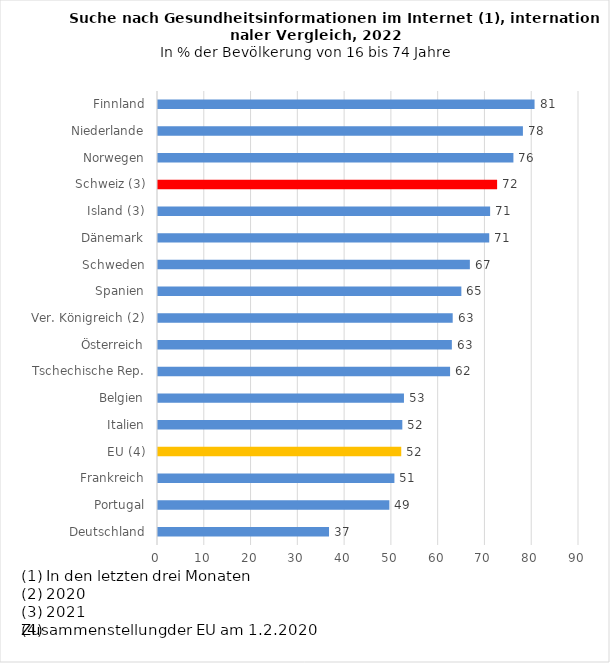
| Category | Series 0 |
|---|---|
| Deutschland | 36.56 |
| Portugal | 49.46 |
| Frankreich | 50.54 |
| EU (4) | 52 |
| Italien | 52.23 |
| Belgien | 52.58 |
| Tschechische Rep. | 62.44 |
| Österreich | 62.82 |
| Ver. Königreich (2) | 63 |
| Spanien | 64.85 |
| Schweden | 66.67 |
| Dänemark | 70.81 |
| Island (3) | 71 |
| Schweiz (3) | 72.495 |
| Norwegen | 75.98 |
| Niederlande | 78.01 |
| Finnland | 80.5 |